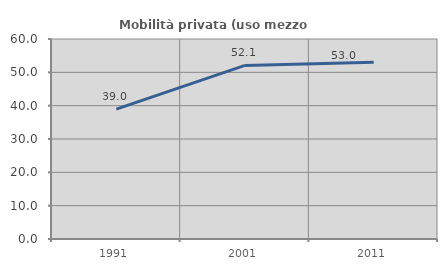
| Category | Mobilità privata (uso mezzo privato) |
|---|---|
| 1991.0 | 38.956 |
| 2001.0 | 52.083 |
| 2011.0 | 53.039 |